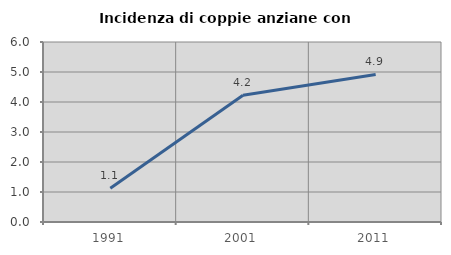
| Category | Incidenza di coppie anziane con figli |
|---|---|
| 1991.0 | 1.124 |
| 2001.0 | 4.225 |
| 2011.0 | 4.918 |